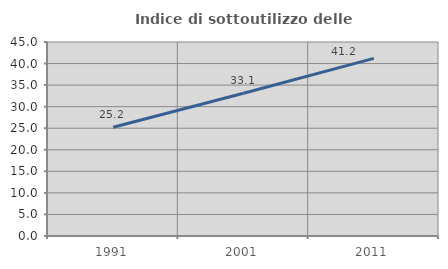
| Category | Indice di sottoutilizzo delle abitazioni  |
|---|---|
| 1991.0 | 25.231 |
| 2001.0 | 33.113 |
| 2011.0 | 41.193 |